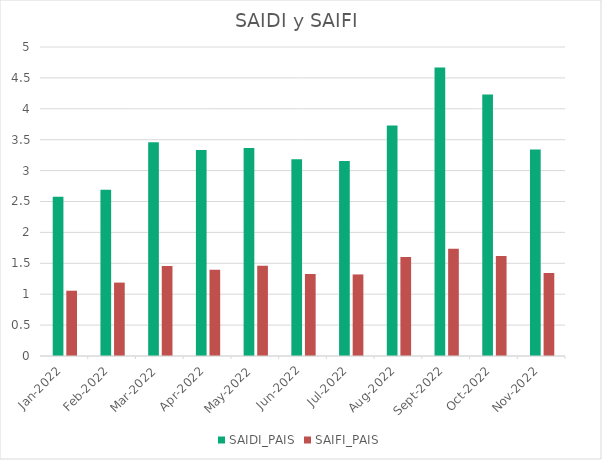
| Category | SAIDI_PAIS | SAIFI_PAIS |
|---|---|---|
| 2022-01-01 | 2.578 | 1.056 |
| 2022-02-01 | 2.692 | 1.188 |
| 2022-03-01 | 3.457 | 1.455 |
| 2022-04-01 | 3.333 | 1.395 |
| 2022-05-01 | 3.364 | 1.461 |
| 2022-06-01 | 3.183 | 1.327 |
| 2022-07-01 | 3.153 | 1.32 |
| 2022-08-01 | 3.73 | 1.6 |
| 2022-09-01 | 4.668 | 1.737 |
| 2022-10-01 | 4.232 | 1.618 |
| 2022-11-01 | 3.342 | 1.343 |